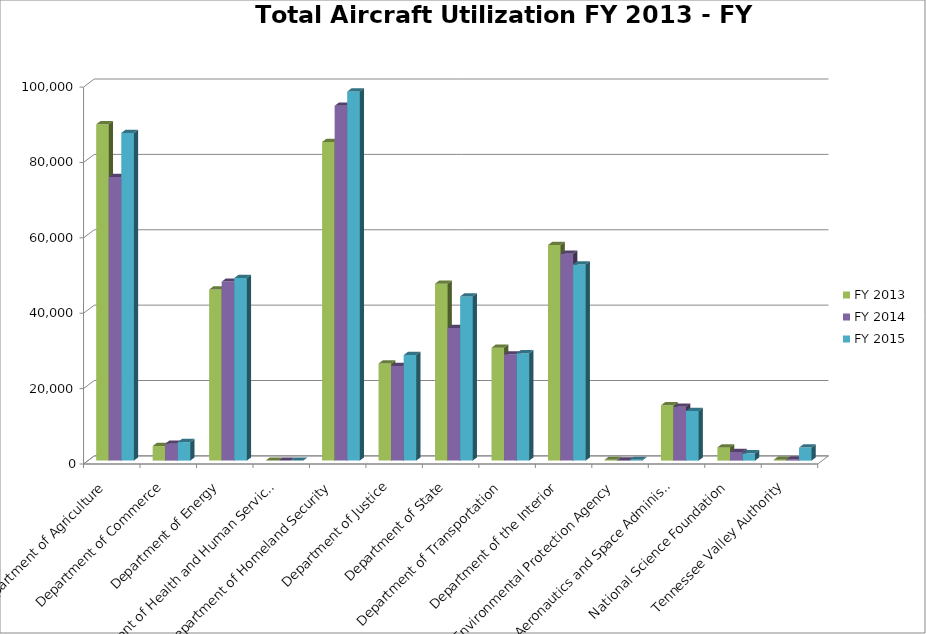
| Category | FY 2013 | FY 2014 | FY 2015 |
|---|---|---|---|
| Department of Agriculture | 89234 | 75229.4 | 86954.8 |
| Department of Commerce | 3863.9 | 4494.9 | 4919.4 |
| Department of Energy | 45389.7 | 47495.5 | 48441 |
| Department of Health and Human Services | 0 | 0 | 0 |
| Department of Homeland Security | 84542.4 | 94155.6 | 97920.7 |
| Department of Justice | 25777.6 | 25101.2 | 27994.7 |
| Department of State | 46953.8 | 35166.6 | 43556.2 |
| Department of Transportation | 29951.8 | 28192 | 28507.5 |
| Department of the Interior | 57207.1 | 54916.9 | 52048.1 |
| Environmental Protection Agency | 198.8 | 47.5 | 199 |
| National Aeronautics and Space Administration | 14678.5 | 14268.7 | 13169.4 |
| National Science Foundation | 3511.8 | 2282.5 | 1934.2 |
| Tennessee Valley Authority | 260 | 319 | 3450.5 |